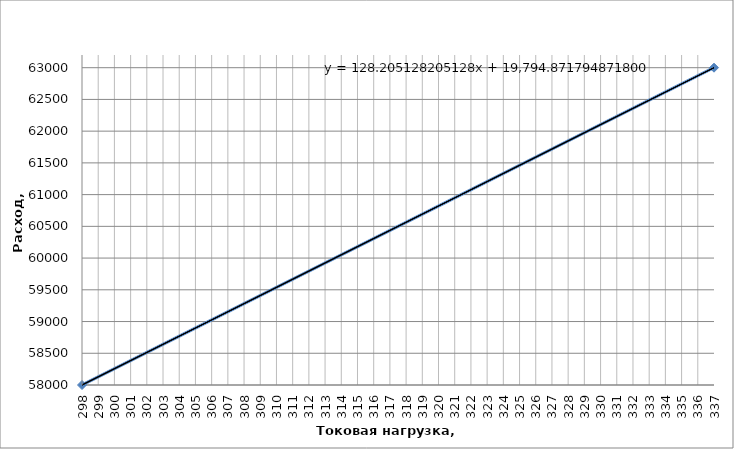
| Category | Расход, м3/ч |
|---|---|
| 298.0 | 58000 |
| 337.0 | 63000 |